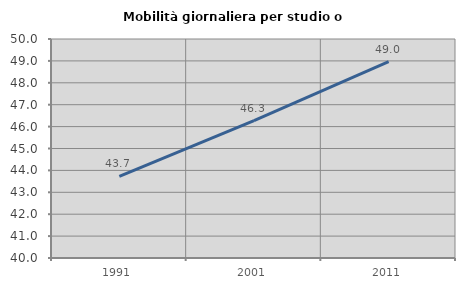
| Category | Mobilità giornaliera per studio o lavoro |
|---|---|
| 1991.0 | 43.722 |
| 2001.0 | 46.277 |
| 2011.0 | 48.961 |